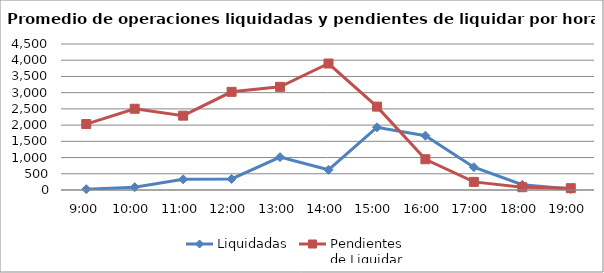
| Category | Liquidadas | Pendientes
de Liquidar |
|---|---|---|
| 0.375 | 25.882 | 2032.412 |
| 0.4166666666666667 | 86.824 | 2504.588 |
| 0.4583333333333333 | 329.353 | 2291.294 |
| 0.5 | 339.529 | 3025.706 |
| 0.5416666666666666 | 1013.412 | 3179.529 |
| 0.583333333333333 | 623 | 3898.471 |
| 0.625 | 1932.118 | 2570.118 |
| 0.666666666666667 | 1674.412 | 947.588 |
| 0.708333333333333 | 703.294 | 250.529 |
| 0.75 | 160.765 | 85.471 |
| 0.791666666666667 | 28.235 | 56.588 |